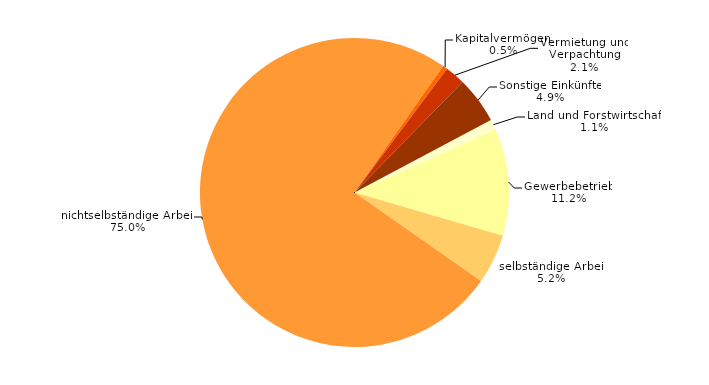
| Category | Series 0 |
|---|---|
| Land und Forstwirtschaft | 1.1 |
| Gewerbebetrieb | 11.2 |
| selbständige Arbeit | 5.2 |
| nichtselbständige Arbeit | 75 |
| Kapitalvermögen¹ | 0.5 |
| Vermietung und Verpachtung | 2.1 |
| Sonstige Einkünfte | 4.9 |